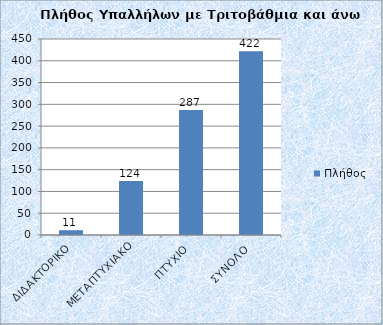
| Category | Πλήθος |
|---|---|
| ΔΙΔΑΚΤΟΡΙΚΟ | 11 |
| ΜΕΤΑΠΤΥΧΙΑΚΟ | 124 |
| ΠΤΥΧΙΟ | 287 |
| ΣΥΝΟΛΟ | 422 |